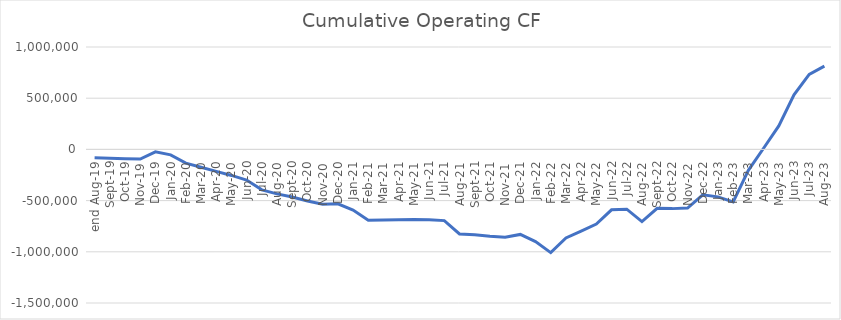
| Category | Series 0 |
|---|---|
| end Aug-19 | -82676 |
| Sep-19 | -86676 |
| Oct-19 | -90676 |
| Nov-19 | -94676 |
| Dec-19 | -23676 |
| Jan-20 | -53676 |
| Feb-20 | -134359.539 |
| Mar-20 | -174024.647 |
| Apr-20 | -214721.686 |
| May-20 | -254275.329 |
| Jun-20 | -299294.77 |
| Jul-20 | -394882.411 |
| Aug-20 | -434337.574 |
| Sep-20 | -465683.087 |
| Oct-20 | -503590.949 |
| Nov-20 | -534857.593 |
| Dec-20 | -531078.983 |
| Jan-21 | -592130.63 |
| Feb-21 | -690784.086 |
| Mar-21 | -688375.22 |
| Apr-21 | -686997.109 |
| May-21 | -684373.531 |
| Jun-21 | -687291.239 |
| Jul-21 | -695540.863 |
| Aug-21 | -825574.254 |
| Sep-21 | -834067.983 |
| Oct-21 | -849178.584 |
| Nov-21 | -857291.944 |
| Dec-21 | -830186.139 |
| Jan-22 | -900915.653 |
| Feb-22 | -1008026.993 |
| Mar-22 | -864812.9 |
| Apr-22 | -797435.292 |
| May-22 | -728527.137 |
| Jun-22 | -590054.021 |
| Jul-22 | -583516.291 |
| Aug-22 | -704863.568 |
| Sep-22 | -575904.562 |
| Oct-22 | -578361.985 |
| Nov-22 | -573173.406 |
| Dec-22 | -443064.364 |
| Jan-23 | -463717.991 |
| Feb-23 | -512577.399 |
| Mar-23 | -204099.919 |
| Apr-23 | 11418.297 |
| May-23 | 229705.48 |
| Jun-23 | 532619.583 |
| Jul-23 | 733324.46 |
| Aug-23 | 812635.494 |